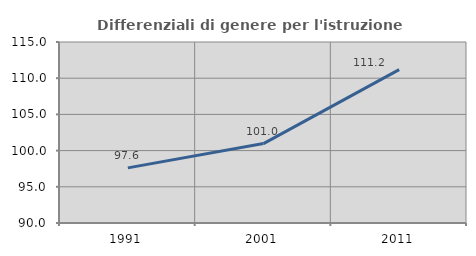
| Category | Differenziali di genere per l'istruzione superiore |
|---|---|
| 1991.0 | 97.613 |
| 2001.0 | 100.967 |
| 2011.0 | 111.189 |